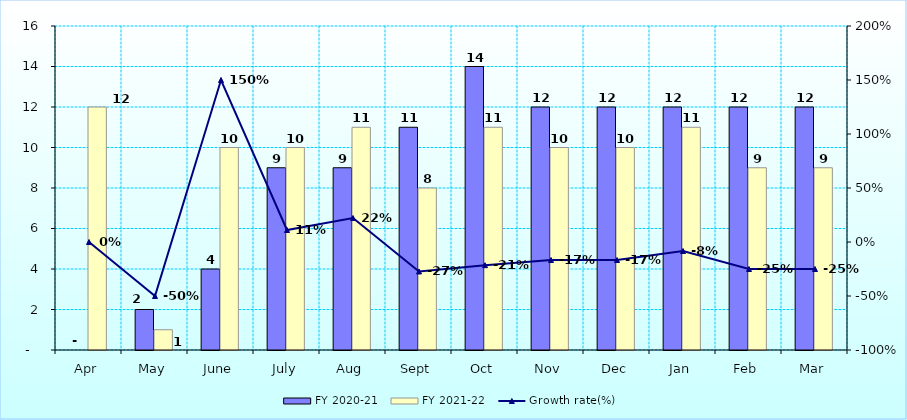
| Category | FY 2020-21 | FY 2021-22 |
|---|---|---|
| Apr | 0 | 12 |
| May | 2 | 1 |
| June | 4 | 10 |
| July | 9 | 10 |
| Aug | 9 | 11 |
| Sept | 11 | 8 |
| Oct | 14 | 11 |
| Nov | 12 | 10 |
| Dec | 12 | 10 |
| Jan | 12 | 11 |
| Feb | 12 | 9 |
| Mar | 12 | 9 |